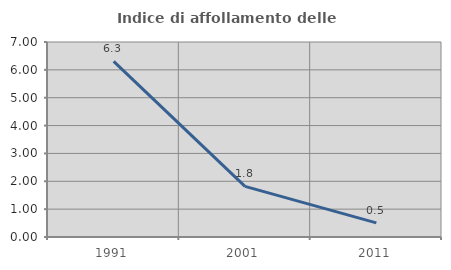
| Category | Indice di affollamento delle abitazioni  |
|---|---|
| 1991.0 | 6.301 |
| 2001.0 | 1.818 |
| 2011.0 | 0.506 |